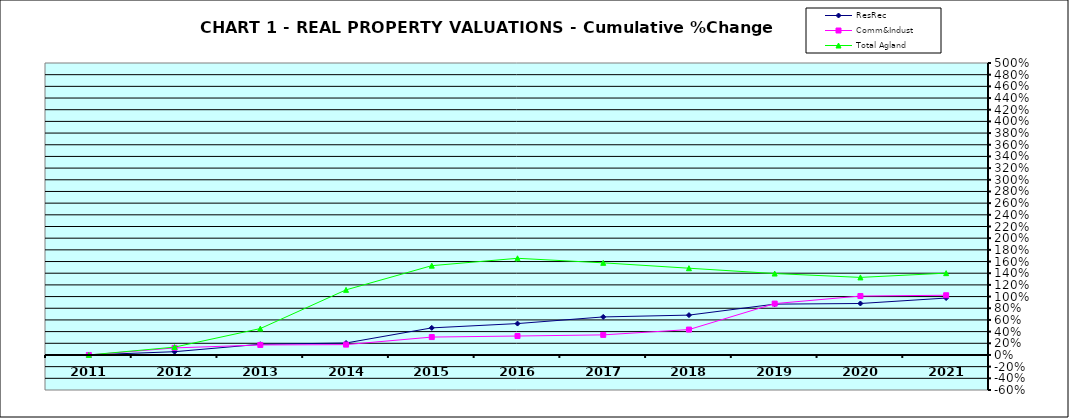
| Category | ResRec | Comm&Indust | Total Agland |
|---|---|---|---|
| 2011.0 | 0 | 0 | 0 |
| 2012.0 | 0.056 | 0.121 | 0.134 |
| 2013.0 | 0.183 | 0.172 | 0.452 |
| 2014.0 | 0.205 | 0.177 | 1.115 |
| 2015.0 | 0.464 | 0.307 | 1.529 |
| 2016.0 | 0.538 | 0.324 | 1.656 |
| 2017.0 | 0.651 | 0.344 | 1.578 |
| 2018.0 | 0.682 | 0.435 | 1.486 |
| 2019.0 | 0.87 | 0.879 | 1.394 |
| 2020.0 | 0.882 | 1.009 | 1.328 |
| 2021.0 | 0.975 | 1.022 | 1.401 |